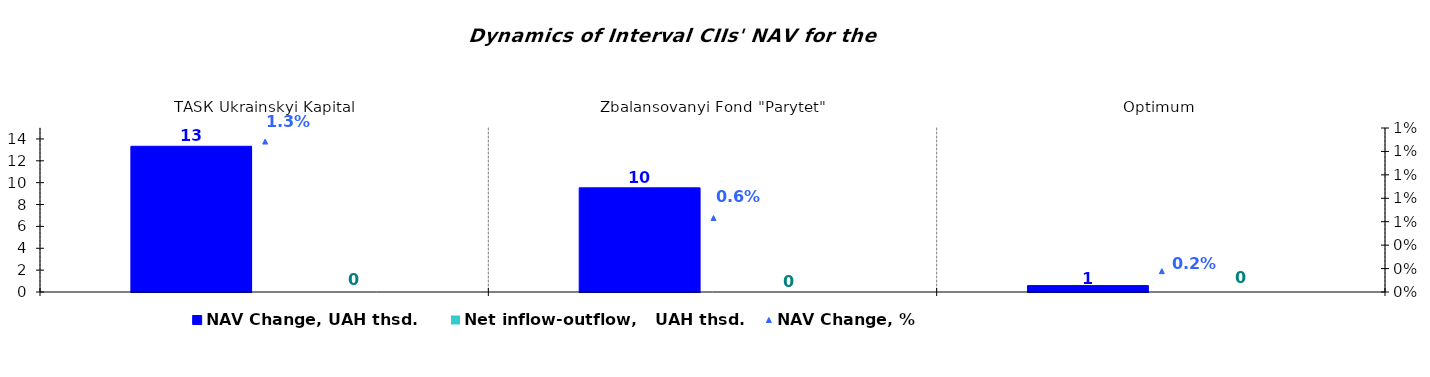
| Category | NAV Change, UAH thsd. | Net inflow-outflow,   UAH thsd. |
|---|---|---|
| ТАSК Ukrainskyi Kapital | 13.327 | 0 |
| Zbalansovanyi Fond "Parytet" | 9.527 | 0 |
| Оptimum | 0.584 | 0 |